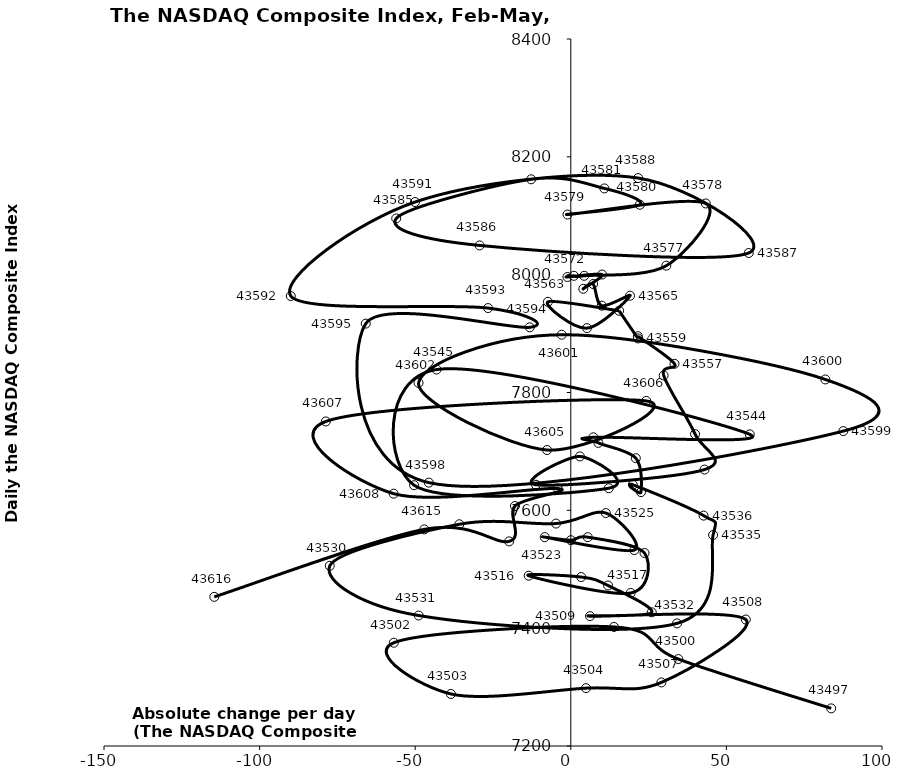
| Category | Series 0 |
|---|---|
| 83.66799999999967 | 7263.867 |
| 34.55475000000001 | 7347.535 |
| 13.873000000000047 | 7402.086 |
| -56.86700000000019 | 7375.281 |
| -38.54100000000017 | 7288.352 |
| 4.888500000000022 | 7298.199 |
| 29.104500000000144 | 7307.906 |
| 56.23649999999998 | 7414.617 |
| 6.16800000000012 | 7420.379 |
| 26.015499999999975 | 7426.953 |
| 11.962599999999838 | 7472.41 |
| 3.331999999999971 | 7486.766 |
| -13.529499999999643 | 7489.07 |
| 19.236499999999978 | 7459.707 |
| 23.688499999999976 | 7527.543 |
| 5.438499999999976 | 7554.461 |
| 0.02349999999978536 | 7549.297 |
| -8.38299999999981 | 7554.508 |
| 20.422000000000025 | 7532.531 |
| 11.258749999999964 | 7595.352 |
| -4.748249999999871 | 7577.566 |
| -35.82400000000007 | 7576.359 |
| -77.44700000000012 | 7505.918 |
| -48.88850000000002 | 7421.465 |
| 34.14949999999999 | 7408.141 |
| 45.72250000000008 | 7558.063 |
| 42.671499999999924 | 7591.031 |
| 19.939499999999953 | 7643.406 |
| 22.560500000000047 | 7630.91 |
| 20.891750000000002 | 7688.527 |
| 8.854499999999916 | 7714.477 |
| 7.246000000000095 | 7723.945 |
| 57.508000000000266 | 7728.969 |
| -43.15050000000019 | 7838.961 |
| -50.354500000000144 | 7642.668 |
| 12.213750000000118 | 7637.543 |
| 2.91800000000012 | 7691.523 |
| -11.17950000000019 | 7643.379 |
| 42.9704999999999 | 7669.164 |
| 39.936500000000024 | 7729.32 |
| 29.8420000000001 | 7828.91 |
| 33.320500000000266 | 7848.688 |
| 21.548499999999876 | 7895.551 |
| 21.56999999999971 | 7891.785 |
| 15.524499999999989 | 7938.691 |
| -7.35349999999994 | 7953.883 |
| 5.179500000000189 | 7909.277 |
| 19.041000000000167 | 7964.242 |
| 9.960999999999785 | 7947.359 |
| 7.1632499999998345 | 7984.164 |
| 4.0157500000000255 | 7976.012 |
| 10.033000000000357 | 8000.227 |
| -1.08199999999988 | 7996.078 |
| 0.9924999999998363 | 7998.063 |
| 4.30074999999988 | 7998.063 |
| 30.6892499999999 | 8015.266 |
| 43.375 | 8120.82 |
| -1.0679999999997563 | 8102.016 |
| 22.19100000000026 | 8118.684 |
| 10.791999999999916 | 8146.398 |
| -12.752750000000106 | 8161.852 |
| -56.10550000000012 | 8095.387 |
| -29.30699999999979 | 8049.641 |
| 57.17750000000024 | 8036.773 |
| 21.628999999999905 | 8163.996 |
| -50.05950000000007 | 8123.289 |
| -89.98450000000003 | 7963.758 |
| -26.585999999999785 | 7943.32 |
| -13.189499999999953 | 7910.586 |
| -65.89075000000003 | 7916.941 |
| -45.612249999999904 | 7647.023 |
| 87.5625 | 7734.492 |
| 81.77749999999969 | 7822.148 |
| -2.931500000000142 | 7898.047 |
| -48.91799999999989 | 7816.285 |
| -7.6404999999999745 | 7702.375 |
| 24.234500000000025 | 7785.723 |
| -78.71900000000005 | 7750.844 |
| -56.91800000000012 | 7628.285 |
| -4.1865999999999985 | 7637.008 |
| -17.939799999999924 | 7607.352 |
| -19.818499999999858 | 7547.309 |
| -47.08050000000003 | 7567.715 |
| -114.56700000000001 | 7453.148 |